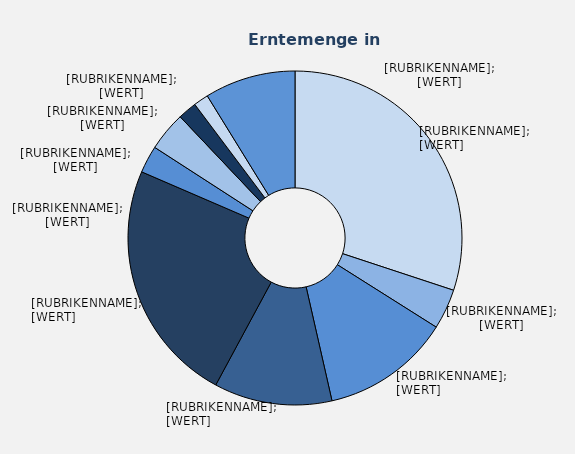
| Category | Series 1 |
|---|---|
| Elstar | 157848 |
| Jonagold | 20438 |
| Jonagored | 65527 |
| Braeburn | 59983 |
| Jonaprince | 123956 |
| Boskoop | 13900 |
| Holsteiner Cox | 19941 |
| Topaz | 9597 |
| Wellant | 7586 |
| Sonstige | 46182 |